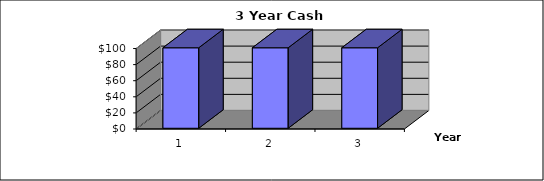
| Category | Series 0 |
|---|---|
| 0 | 100 |
| 1 | 100 |
| 2 | 100 |